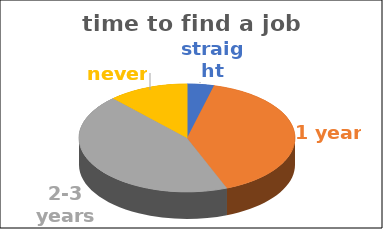
| Category | time to find a job | Series 1 | Series 2 | Series 3 | Series 4 |
|---|---|---|---|---|---|
| straight away | 0.04 |  |  |  |  |
| 1 year | 0.4 |  |  |  |  |
| 2-3 years | 0.44 |  |  |  |  |
| never | 0.12 |  |  |  |  |